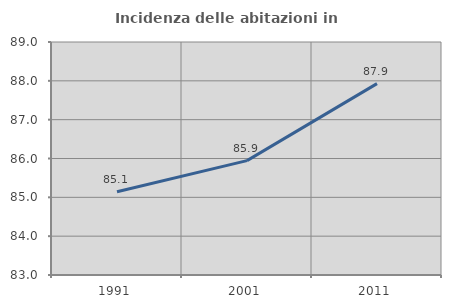
| Category | Incidenza delle abitazioni in proprietà  |
|---|---|
| 1991.0 | 85.144 |
| 2001.0 | 85.945 |
| 2011.0 | 87.929 |